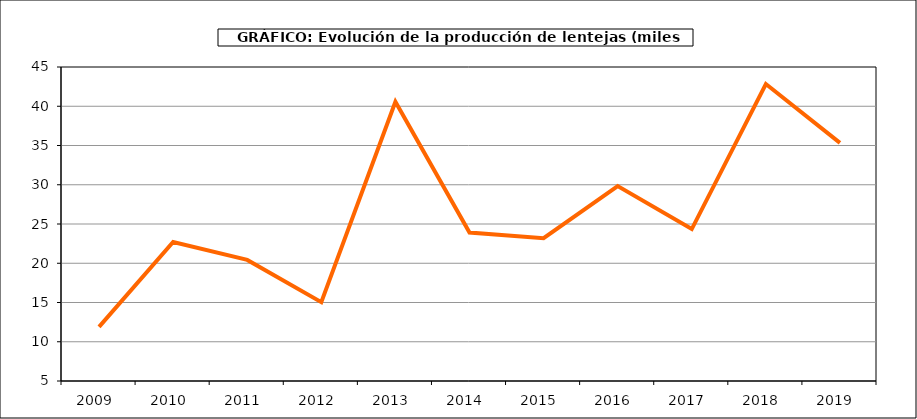
| Category | Producción |
|---|---|
| 2009.0 | 11.9 |
| 2010.0 | 22.715 |
| 2011.0 | 20.426 |
| 2012.0 | 15.046 |
| 2013.0 | 40.57 |
| 2014.0 | 23.905 |
| 2015.0 | 23.193 |
| 2016.0 | 29.827 |
| 2017.0 | 24.357 |
| 2018.0 | 42.827 |
| 2019.0 | 35.333 |